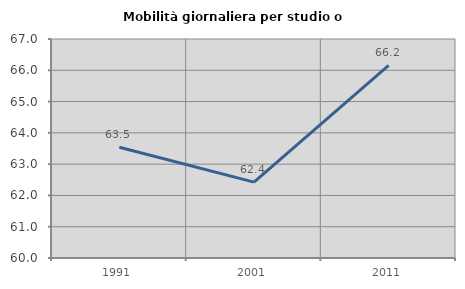
| Category | Mobilità giornaliera per studio o lavoro |
|---|---|
| 1991.0 | 63.542 |
| 2001.0 | 62.424 |
| 2011.0 | 66.154 |